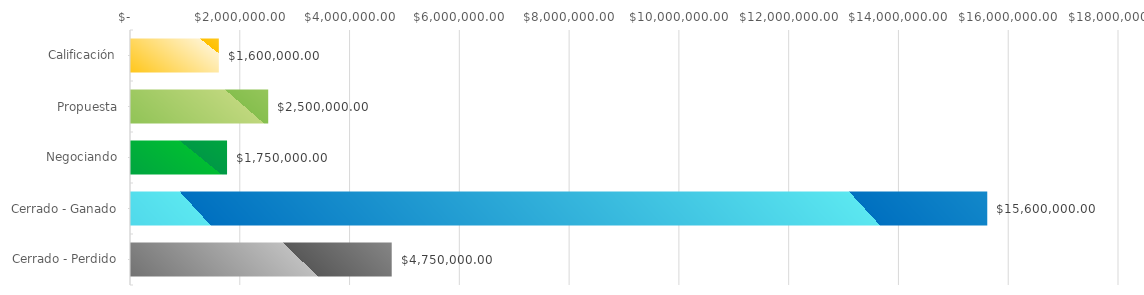
| Category | Series 0 |
|---|---|
| Calificación | 1600000 |
| Propuesta | 2500000 |
| Negociando | 1750000 |
| Cerrado - Ganado | 15600000 |
| Cerrado - Perdido | 4750000 |